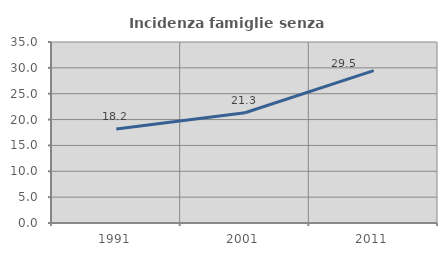
| Category | Incidenza famiglie senza nuclei |
|---|---|
| 1991.0 | 18.174 |
| 2001.0 | 21.329 |
| 2011.0 | 29.458 |